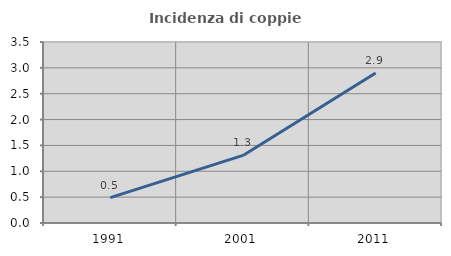
| Category | Incidenza di coppie miste |
|---|---|
| 1991.0 | 0.49 |
| 2001.0 | 1.307 |
| 2011.0 | 2.901 |